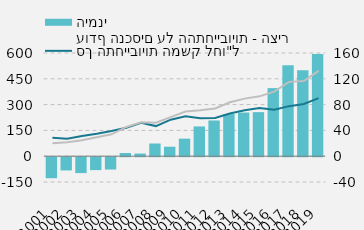
| Category | עודף הנכסים על ההתחייבויות - הציר הימני |
|---|---|
| 0 | -32564.814 |
| 1 | -20524.014 |
| 2 | -24671.262 |
| 3 | -20020.738 |
| 4 | -19141.928 |
| 5 | 4941.54 |
| 6 | 4107.228 |
| 7 | 19653.422 |
| 8 | 14699.297 |
| 9 | 27224.988 |
| 10 | 46144.683 |
| 11 | 55368.915 |
| 12 | 65347.238 |
| 13 | 67665.623 |
| 14 | 68305.455 |
| 15 | 105525.4 |
| 16 | 141180.571 |
| 17 | 133390.265 |
| 18 | 158394 |